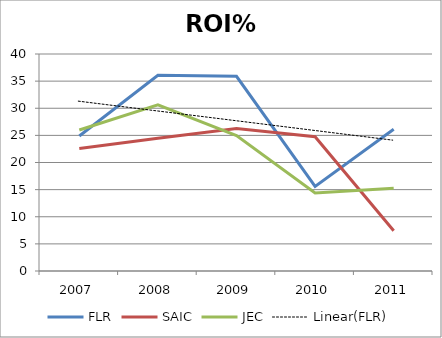
| Category | FLR | SAIC | JEC |
|---|---|---|---|
| 2007.0 | 24.89 | 22.6 | 26 |
| 2008.0 | 36.07 | 24.46 | 30.64 |
| 2009.0 | 35.89 | 26.28 | 24.96 |
| 2010.0 | 15.59 | 24.75 | 14.37 |
| 2011.0 | 26.14 | 7.43 | 15.26 |